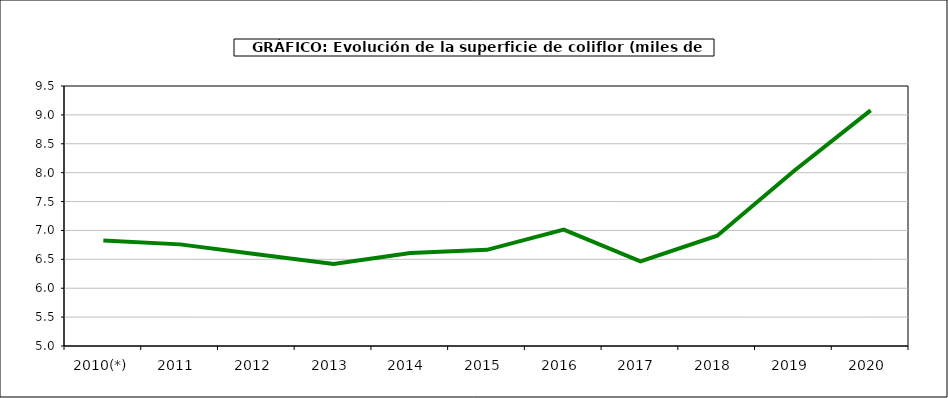
| Category | superficie |
|---|---|
| 2010(*) | 6.826 |
| 2011  | 6.759 |
| 2012  | 6.587 |
| 2013  | 6.418 |
| 2014  | 6.61 |
| 2015  | 6.664 |
| 2016  | 7.014 |
| 2017  | 6.465 |
| 2018  | 6.909 |
| 2019  | 8.03 |
| 2020  | 9.079 |